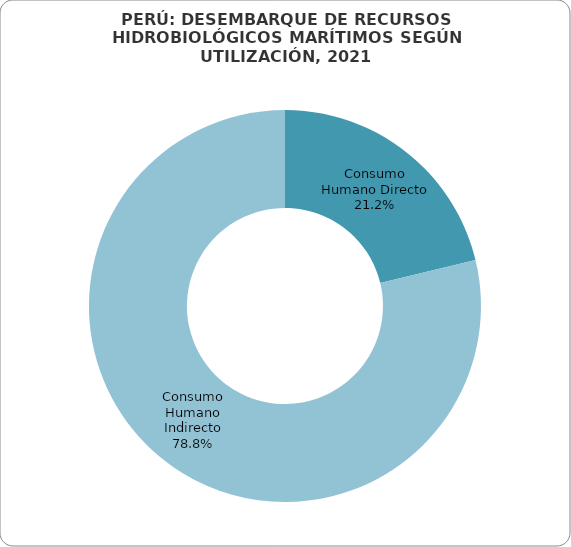
| Category | Series 0 |
|---|---|
| Consumo Humano Directo | 1393169.946 |
| Consumo Humano Indirecto | 5170189.366 |